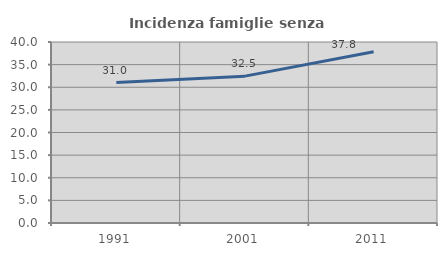
| Category | Incidenza famiglie senza nuclei |
|---|---|
| 1991.0 | 31.048 |
| 2001.0 | 32.456 |
| 2011.0 | 37.832 |